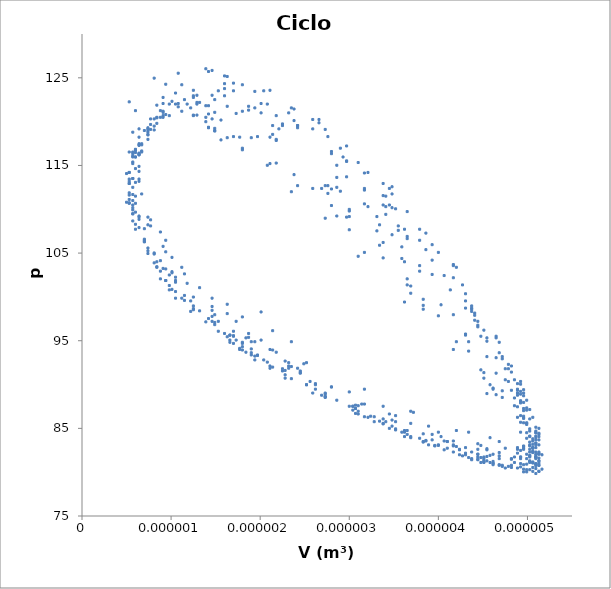
| Category | p (kPa) |
|---|---|
| 5.300000000000005e-07 | 122.258 |
| 4.580000000000001e-06 | 83.934 |
| 2.8000000000000003e-06 | 116.592 |
| 2.0100000000000002e-06 | 98.283 |
| 4.923000000000001e-06 | 89.221 |
| 6.000000000000007e-07 | 121.252 |
| 4.683000000000001e-06 | 83.496 |
| 2.42e-06 | 119.551 |
| 2.3500000000000004e-06 | 94.886 |
| 4.648000000000001e-06 | 93.059 |
| 6.000000000000007e-07 | 115.965 |
| 4.957000000000001e-06 | 82.928 |
| 1.63e-06 | 125.153 |
| 3.1700000000000006e-06 | 89.473 |
| 4.065000000000001e-06 | 102.437 |
| 9.4e-07 | 106.465 |
| 4.991400000000001e-06 | 84.502 |
| 8.100000000000004e-07 | 124.964 |
| 4.340000000000001e-06 | 84.566 |
| 2.9300000000000003e-06 | 115.965 |
| 2.1400000000000003e-06 | 96.145 |
| 4.717000000000001e-06 | 93.186 |
| 6.400000000000003e-07 | 114.328 |
| 5.025700000000001e-06 | 82.991 |
| 1.3900000000000002e-06 | 126.033 |
| 3.7200000000000004e-06 | 86.83 |
| 3.4500000000000004e-06 | 110.489 |
| 1.63e-06 | 99.163 |
| 4.8880000000000005e-06 | 90.101 |
| 5.300000000000005e-07 | 116.533 |
| 4.957000000000001e-06 | 82.991 |
| 1.4600000000000004e-06 | 125.844 |
| 3.6900000000000002e-06 | 86.956 |
| 3.3800000000000002e-06 | 111.558 |
| 1.8000000000000001e-06 | 97.715 |
| 4.8200000000000004e-06 | 92.117 |
| 6.400000000000003e-07 | 113.448 |
| 5.0943000000000005e-06 | 83.307 |
| 1.0800000000000002e-06 | 125.528 |
| 4.202000000000001e-06 | 84.755 |
| 2.7600000000000003e-06 | 118.293 |
| 2.5200000000000004e-06 | 92.495 |
| 4.305e-06 | 100.358 |
| 1.01e-06 | 104.512 |
| 5.025700000000001e-06 | 87.146 |
| 5.700000000000002e-07 | 118.798 |
| 4.8880000000000005e-06 | 82.802 |
| 1.4200000000000004e-06 | 125.718 |
| 3.890000000000001e-06 | 85.256 |
| 2.9e-06 | 116.971 |
| 2.4900000000000003e-06 | 92.369 |
| 4.271e-06 | 101.368 |
| 1.1500000000000004e-06 | 102.626 |
| 4.957000000000001e-06 | 89.41 |
| 6.000000000000007e-07 | 114.643 |
| 5.0943000000000005e-06 | 83.307 |
| 9.4e-07 | 124.27 |
| 4.4430000000000005e-06 | 83.244 |
| 2.11e-06 | 123.579 |
| 3.3800000000000002e-06 | 87.524 |
| 3.3800000000000002e-06 | 112.943 |
| 2.1400000000000003e-06 | 93.939 |
| 4.305e-06 | 99.541 |
| 1.01e-06 | 102.875 |
| 4.8880000000000005e-06 | 89.347 |
| 5.300000000000005e-07 | 112.943 |
| 5.1286e-06 | 84.061 |
| 8.400000000000001e-07 | 121.879 |
| 4.751000000000001e-06 | 82.739 |
| 1.6000000000000004e-06 | 125.216 |
| 4.000000000000001e-06 | 84.566 |
| 2.6600000000000004e-06 | 120.246 |
| 3e-06 | 89.158 |
| 3.65e-06 | 109.736 |
| 1.94e-06 | 94.886 |
| 4.374000000000001e-06 | 98.598 |
| 1.0500000000000005e-06 | 102.248 |
| 4.923000000000001e-06 | 90.041 |
| 6.000000000000007e-07 | 110.679 |
| 5.0943000000000005e-06 | 84.502 |
| 6.400000000000003e-07 | 119.172 |
| 4.8880000000000005e-06 | 82.613 |
| 1.1199999999999999e-06 | 124.207 |
| 4.4770000000000005e-06 | 83.055 |
| 2.0400000000000004e-06 | 123.516 |
| 3.6900000000000002e-06 | 85.572 |
| 2.9700000000000004e-06 | 117.224 |
| 2.8000000000000003e-06 | 89.726 |
| 3.7900000000000006e-06 | 107.724 |
| 1.8400000000000002e-06 | 95.324 |
| 4.408000000000001e-06 | 98.157 |
| 1.0500000000000005e-06 | 101.68 |
| 4.923000000000001e-06 | 90.353 |
| 6.400000000000003e-07 | 109.104 |
| 5.0943000000000005e-06 | 85.13 |
| 6.000000000000007e-07 | 116.782 |
| 4.957000000000001e-06 | 82.739 |
| 9.100000000000003e-07 | 122.763 |
| 4.5450000000000005e-06 | 82.55 |
| 1.7000000000000002e-06 | 124.396 |
| 4.03e-06 | 84.061 |
| 2.59e-06 | 120.246 |
| 3.1700000000000006e-06 | 87.773 |
| 3.48e-06 | 112.568 |
| 2.3200000000000002e-06 | 92.117 |
| 4.202000000000001e-06 | 103.38 |
| 1.4900000000000001e-06 | 97.967 |
| 4.683000000000001e-06 | 94.823 |
| 8.800000000000006e-07 | 104.134 |
| 4.991400000000001e-06 | 88.215 |
| 5.700000000000002e-07 | 111.685 |
| 5.0943000000000005e-06 | 84.124 |
| 6.400000000000003e-07 | 118.23 |
| 4.923000000000001e-06 | 82.486 |
| 1.0500000000000005e-06 | 123.264 |
| 4.5450000000000005e-06 | 82.676 |
| 1.8000000000000001e-06 | 124.207 |
| 3.9300000000000005e-06 | 84.313 |
| 2.6600000000000004e-06 | 119.867 |
| 3.1400000000000004e-06 | 87.773 |
| 3.4500000000000004e-06 | 112.379 |
| 2.3200000000000002e-06 | 91.864 |
| 4.168000000000001e-06 | 103.696 |
| 1.5300000000000002e-06 | 97.214 |
| 4.648000000000001e-06 | 95.513 |
| 9.100000000000003e-07 | 103.254 |
| 4.957000000000001e-06 | 89.031 |
| 5.700000000000002e-07 | 109.925 |
| 5.0943000000000005e-06 | 84.692 |
| 6.000000000000007e-07 | 116.845 |
| 4.957000000000001e-06 | 82.613 |
| 9.100000000000003e-07 | 122.068 |
| 4.683000000000001e-06 | 82.238 |
| 1.6000000000000004e-06 | 124.333 |
| 4.168000000000001e-06 | 83.56 |
| 2.3500000000000004e-06 | 121.567 |
| 3.4500000000000004e-06 | 86.641 |
| 3.1000000000000004e-06 | 115.334 |
| 2.6200000000000003e-06 | 90.101 |
| 3.86e-06 | 107.282 |
| 1.8000000000000001e-06 | 94.697 |
| 4.374000000000001e-06 | 98.725 |
| 1.1500000000000004e-06 | 100.169 |
| 4.8200000000000004e-06 | 91.422 |
| 7.000000000000006e-07 | 106.339 |
| 5.060000000000001e-06 | 86.262 |
| 5.300000000000005e-07 | 113.196 |
| 5.025700000000001e-06 | 83.118 |
| 8.100000000000004e-07 | 119.488 |
| 4.8880000000000005e-06 | 82.175 |
| 1.2500000000000003e-06 | 123.579 |
| 4.4430000000000005e-06 | 82.613 |
| 1.94e-06 | 123.453 |
| 3.830000000000001e-06 | 84.376 |
| 2.73e-06 | 119.113 |
| 3.0700000000000003e-06 | 87.647 |
| 3.48e-06 | 111.748 |
| 2.28e-06 | 91.612 |
| 4.168000000000001e-06 | 103.569 |
| 1.4900000000000001e-06 | 96.835 |
| 4.648000000000001e-06 | 95.324 |
| 8.800000000000006e-07 | 102.938 |
| 4.957000000000001e-06 | 88.72 |
| 5.700000000000002e-07 | 109.483 |
| 5.1286e-06 | 84.439 |
| 6.7e-07 | 116.533 |
| 5.025700000000001e-06 | 82.301 |
| 9.800000000000004e-07 | 122.005 |
| 4.614000000000001e-06 | 82.049 |
| 1.6000000000000004e-06 | 123.769 |
| 4.1000000000000006e-06 | 83.496 |
| 2.38e-06 | 121.441 |
| 3.3800000000000002e-06 | 86.077 |
| 3.21e-06 | 114.202 |
| 2.5200000000000004e-06 | 89.978 |
| 3.9300000000000005e-06 | 105.96 |
| 1.7000000000000002e-06 | 95.513 |
| 4.4430000000000005e-06 | 97.214 |
| 1.01e-06 | 100.863 |
| 4.8540000000000005e-06 | 90.542 |
| 6.000000000000007e-07 | 107.724 |
| 5.1286e-06 | 85.003 |
| 6.400000000000003e-07 | 114.896 |
| 5.060000000000001e-06 | 82.238 |
| 9.100000000000003e-07 | 121.188 |
| 4.683000000000001e-06 | 81.859 |
| 1.5300000000000002e-06 | 123.516 |
| 4.168000000000001e-06 | 82.991 |
| 2.3200000000000002e-06 | 120.999 |
| 3.41e-06 | 85.761 |
| 3.1700000000000006e-06 | 114.138 |
| 2.5200000000000004e-06 | 89.978 |
| 4.000000000000001e-06 | 105.08 |
| 1.63e-06 | 95.45 |
| 4.5110000000000005e-06 | 96.208 |
| 9.4e-07 | 101.869 |
| 4.923000000000001e-06 | 88.905 |
| 6.400000000000003e-07 | 108.856 |
| 5.1286e-06 | 84.313 |
| 6.400000000000003e-07 | 116.218 |
| 4.991400000000001e-06 | 82.049 |
| 1.01e-06 | 122.321 |
| 4.580000000000001e-06 | 81.922 |
| 1.7000000000000002e-06 | 123.516 |
| 3.9300000000000005e-06 | 83.686 |
| 2.59e-06 | 119.172 |
| 3.1000000000000004e-06 | 86.956 |
| 3.41e-06 | 111.499 |
| 2.25e-06 | 91.548 |
| 4.168000000000001e-06 | 102.185 |
| 1.4200000000000004e-06 | 97.529 |
| 4.683000000000001e-06 | 93.628 |
| 8.100000000000004e-07 | 103.885 |
| 4.991400000000001e-06 | 87.083 |
| 6.000000000000007e-07 | 111.499 |
| 5.1286e-06 | 83.118 |
| 7.400000000000002e-07 | 118.482 |
| 4.8540000000000005e-06 | 81.733 |
| 1.2500000000000003e-06 | 122.763 |
| 4.374000000000001e-06 | 82.301 |
| 2.0800000000000004e-06 | 122.005 |
| 3.6200000000000005e-06 | 84.755 |
| 2.9700000000000004e-06 | 115.523 |
| 2.73e-06 | 89.031 |
| 3.7900000000000006e-06 | 106.465 |
| 1.7700000000000004e-06 | 94.002 |
| 4.4430000000000005e-06 | 96.772 |
| 9.800000000000004e-07 | 100.8 |
| 4.8880000000000005e-06 | 88.783 |
| 5.700000000000002e-07 | 108.667 |
| 5.1286e-06 | 83.686 |
| 6.7e-07 | 116.655 |
| 4.923000000000001e-06 | 81.733 |
| 1.1500000000000004e-06 | 122.51 |
| 4.4430000000000005e-06 | 82.049 |
| 2.0100000000000002e-06 | 122.068 |
| 3.65e-06 | 84.755 |
| 2.9700000000000004e-06 | 115.46 |
| 2.69e-06 | 88.783 |
| 3.86e-06 | 105.392 |
| 1.6600000000000002e-06 | 94.823 |
| 4.5450000000000005e-06 | 95.324 |
| 8.800000000000006e-07 | 102.058 |
| 4.991400000000001e-06 | 87.335 |
| 5.300000000000005e-07 | 110.679 |
| 5.060000000000001e-06 | 82.802 |
| 8.100000000000004e-07 | 119.05 |
| 4.8200000000000004e-06 | 81.544 |
| 1.4600000000000004e-06 | 123.011 |
| 4.168000000000001e-06 | 83.118 |
| 2.42e-06 | 119.551 |
| 3.21e-06 | 86.262 |
| 3.48e-06 | 110.178 |
| 2.1400000000000003e-06 | 91.99 |
| 4.374000000000001e-06 | 98.973 |
| 1.1500000000000004e-06 | 99.604 |
| 4.8880000000000005e-06 | 89.473 |
| 6.000000000000007e-07 | 108.288 |
| 5.060000000000001e-06 | 83.56 |
| 6.400000000000003e-07 | 117.476 |
| 4.8200000000000004e-06 | 81.48 |
| 1.2900000000000004e-06 | 123.011 |
| 4.202000000000001e-06 | 82.928 |
| 2.38e-06 | 120.119 |
| 3.2400000000000003e-06 | 86.388 |
| 3.52e-06 | 110.051 |
| 2.0800000000000004e-06 | 92.558 |
| 4.408000000000001e-06 | 97.904 |
| 1.0500000000000005e-06 | 100.611 |
| 4.923000000000001e-06 | 88.152 |
| 5.700000000000002e-07 | 110.178 |
| 5.060000000000001e-06 | 82.739 |
| 7.700000000000008e-07 | 119.677 |
| 4.683000000000001e-06 | 81.544 |
| 1.6000000000000004e-06 | 122.948 |
| 3.86e-06 | 83.56 |
| 2.8000000000000003e-06 | 116.344 |
| 2.73e-06 | 88.657 |
| 3.9300000000000005e-06 | 104.197 |
| 1.6000000000000004e-06 | 95.829 |
| 4.7860000000000004e-06 | 92.306 |
| 7.400000000000002e-07 | 105.581 |
| 5.0943000000000005e-06 | 84.502 |
| 6.000000000000007e-07 | 115.965 |
| 4.923000000000001e-06 | 81.544 |
| 1.2500000000000003e-06 | 122.948 |
| 4.237e-06 | 82.613 |
| 2.42e-06 | 119.299 |
| 3.0700000000000003e-06 | 87.272 |
| 3.6200000000000005e-06 | 107.724 |
| 1.8000000000000001e-06 | 93.939 |
| 4.5450000000000005e-06 | 94.949 |
| 8.400000000000001e-07 | 103.38 |
| 4.991400000000001e-06 | 85.635 |
| 5e-07 | 114.075 |
| 4.923000000000001e-06 | 81.733 |
| 1.0800000000000002e-06 | 122.068 |
| 4.4430000000000005e-06 | 82.049 |
| 2.1800000000000003e-06 | 120.683 |
| 3.3800000000000002e-06 | 85.572 |
| 3.41e-06 | 110.3 |
| 2.11e-06 | 92.117 |
| 4.408000000000001e-06 | 97.34 |
| 9.800000000000004e-07 | 101.305 |
| 4.957000000000001e-06 | 87.019 |
| 5.300000000000005e-07 | 111.874 |
| 5.025700000000001e-06 | 81.922 |
| 8.800000000000006e-07 | 121.252 |
| 4.4770000000000005e-06 | 81.67 |
| 1.94e-06 | 121.567 |
| 3.48e-06 | 85.256 |
| 3.1700000000000006e-06 | 112.19 |
| 2.28e-06 | 91.111 |
| 4.374000000000001e-06 | 98.346 |
| 1.1199999999999999e-06 | 99.857 |
| 4.957000000000001e-06 | 87.962 |
| 5.700000000000002e-07 | 110.489 |
| 5.060000000000001e-06 | 82.301 |
| 8.400000000000001e-07 | 120.494 |
| 4.5450000000000005e-06 | 81.796 |
| 1.8700000000000003e-06 | 121.753 |
| 3.5900000000000004e-06 | 84.566 |
| 3.1700000000000006e-06 | 112.379 |
| 2.28e-06 | 90.732 |
| 4.305e-06 | 98.725 |
| 1.0500000000000005e-06 | 99.857 |
| 4.8880000000000005e-06 | 87.461 |
| 5e-07 | 110.805 |
| 5.025700000000001e-06 | 81.859 |
| 9.4e-07 | 120.81 |
| 4.5110000000000005e-06 | 81.417 |
| 2.0100000000000002e-06 | 120.999 |
| 3.4500000000000004e-06 | 85.003 |
| 3.3800000000000002e-06 | 110.489 |
| 2.11e-06 | 91.864 |
| 4.4430000000000005e-06 | 96.583 |
| 9.4e-07 | 101.869 |
| 5.025700000000001e-06 | 86.077 |
| 5.300000000000005e-07 | 112.943 |
| 4.991400000000001e-06 | 81.544 |
| 1.0500000000000005e-06 | 122.005 |
| 4.305e-06 | 81.985 |
| 2.25e-06 | 119.551 |
| 3.1000000000000004e-06 | 86.641 |
| 3.65e-06 | 106.903 |
| 1.8000000000000001e-06 | 94.318 |
| 4.717000000000001e-06 | 92.933 |
| 8.100000000000004e-07 | 104.891 |
| 5.0943000000000005e-06 | 83.934 |
| 6.400000000000003e-07 | 116.407 |
| 4.8540000000000005e-06 | 81.106 |
| 1.4900000000000001e-06 | 122.51 |
| 3.96e-06 | 82.991 |
| 2.86e-06 | 115.022 |
| 2.59e-06 | 89.031 |
| 4.1340000000000006e-06 | 100.8 |
| 1.2200000000000006e-06 | 98.346 |
| 4.923000000000001e-06 | 88.089 |
| 5.300000000000005e-07 | 110.742 |
| 5.025700000000001e-06 | 81.733 |
| 9.100000000000003e-07 | 121.062 |
| 4.374000000000001e-06 | 81.544 |
| 2.25e-06 | 119.741 |
| 3.1700000000000006e-06 | 86.325 |
| 3.65e-06 | 106.651 |
| 1.7000000000000002e-06 | 94.697 |
| 4.751000000000001e-06 | 91.801 |
| 7.000000000000006e-07 | 106.465 |
| 5.060000000000001e-06 | 82.802 |
| 7.400000000000002e-07 | 118.545 |
| 4.580000000000001e-06 | 81.106 |
| 1.8000000000000001e-06 | 121.188 |
| 3.52e-06 | 84.818 |
| 3.41e-06 | 109.42 |
| 1.94e-06 | 92.807 |
| 4.5450000000000005e-06 | 93.186 |
| 7.400000000000002e-07 | 104.954 |
| 5.060000000000001e-06 | 83.181 |
| 7.400000000000002e-07 | 117.977 |
| 4.683000000000001e-06 | 80.853 |
| 1.8700000000000003e-06 | 121.315 |
| 3.52e-06 | 84.944 |
| 3.5500000000000003e-06 | 108.098 |
| 1.8400000000000002e-06 | 93.691 |
| 4.7860000000000004e-06 | 91.801 |
| 7.000000000000006e-07 | 106.587 |
| 5.1286e-06 | 82.301 |
| 8.400000000000001e-07 | 119.804 |
| 4.4770000000000005e-06 | 81.106 |
| 2.2100000000000004e-06 | 119.172 |
| 3.0700000000000003e-06 | 86.704 |
| 3.7900000000000006e-06 | 103.569 |
| 1.3900000000000002e-06 | 97.151 |
| 4.923000000000001e-06 | 87.899 |
| 5.300000000000005e-07 | 111.621 |
| 5.060000000000001e-06 | 81.106 |
| 1.2900000000000004e-06 | 122.194 |
| 4.1000000000000006e-06 | 82.739 |
| 2.9700000000000004e-06 | 113.701 |
| 2.3500000000000004e-06 | 90.669 |
| 4.4770000000000005e-06 | 95.513 |
| 8.400000000000001e-07 | 104.007 |
| 5.0943000000000005e-06 | 83.118 |
| 7.400000000000002e-07 | 118.798 |
| 4.5450000000000005e-06 | 81.291 |
| 2.1400000000000003e-06 | 119.551 |
| 3.04e-06 | 87.524 |
| 3.9300000000000005e-06 | 102.563 |
| 1.2500000000000003e-06 | 98.662 |
| 4.957000000000001e-06 | 86.203 |
| 5.300000000000005e-07 | 114.202 |
| 4.923000000000001e-06 | 80.979 |
| 1.63e-06 | 121.753 |
| 3.6200000000000005e-06 | 84.566 |
| 3.5500000000000003e-06 | 107.597 |
| 1.7000000000000002e-06 | 95.576 |
| 4.8880000000000005e-06 | 89.031 |
| 5.700000000000002e-07 | 110.994 |
| 5.025700000000001e-06 | 81.106 |
| 1.32e-06 | 122.194 |
| 3.86e-06 | 83.623 |
| 3.21e-06 | 110.3 |
| 1.9000000000000004e-06 | 93.375 |
| 4.751000000000001e-06 | 90.542 |
| 5.700000000000002e-07 | 109.483 |
| 5.025700000000001e-06 | 81.291 |
| 1.1800000000000001e-06 | 122.005 |
| 3.890000000000001e-06 | 83.118 |
| 3.1700000000000006e-06 | 110.615 |
| 1.97e-06 | 93.312 |
| 4.7860000000000004e-06 | 90.353 |
| 6.000000000000007e-07 | 109.673 |
| 5.060000000000001e-06 | 81.043 |
| 1.2900000000000004e-06 | 122.005 |
| 3.830000000000001e-06 | 83.433 |
| 3.31e-06 | 109.168 |
| 1.7700000000000004e-06 | 94.129 |
| 4.8200000000000004e-06 | 89.347 |
| 5.300000000000005e-07 | 111.12 |
| 4.957000000000001e-06 | 80.853 |
| 1.4200000000000004e-06 | 121.816 |
| 3.6200000000000005e-06 | 84.061 |
| 3.48e-06 | 107.092 |
| 1.5300000000000002e-06 | 96.081 |
| 4.957000000000001e-06 | 87.272 |
| 5.700000000000002e-07 | 113.511 |
| 4.923000000000001e-06 | 80.601 |
| 1.7300000000000004e-06 | 120.936 |
| 3.3800000000000002e-06 | 85.508 |
| 3.7900000000000006e-06 | 102.938 |
| 1.2500000000000003e-06 | 98.973 |
| 5.025700000000001e-06 | 84.944 |
| 6.000000000000007e-07 | 116.719 |
| 4.614000000000001e-06 | 81.043 |
| 2.1400000000000003e-06 | 118.545 |
| 2.86e-06 | 88.215 |
| 4.168000000000001e-06 | 97.967 |
| 8.400000000000001e-07 | 103.443 |
| 5.025700000000001e-06 | 82.613 |
| 8.100000000000004e-07 | 120.309 |
| 4.237e-06 | 81.985 |
| 2.86e-06 | 113.637 |
| 2.25e-06 | 91.801 |
| 4.648000000000001e-06 | 91.3 |
| 6.400000000000003e-07 | 109.231 |
| 5.060000000000001e-06 | 81.169 |
| 1.3900000000000002e-06 | 121.816 |
| 3.65e-06 | 84.313 |
| 3.5900000000000004e-06 | 105.708 |
| 1.4600000000000004e-06 | 97.214 |
| 4.991400000000001e-06 | 85.572 |
| 5.700000000000002e-07 | 116.091 |
| 4.614000000000001e-06 | 80.853 |
| 2.1800000000000003e-06 | 117.977 |
| 2.73e-06 | 88.594 |
| 4.305e-06 | 95.766 |
| 7.400000000000002e-07 | 105.266 |
| 5.0943000000000005e-06 | 82.049 |
| 1.0800000000000002e-06 | 121.69 |
| 3.96e-06 | 83.055 |
| 3.34e-06 | 108.225 |
| 1.6600000000000002e-06 | 95.64 |
| 4.957000000000001e-06 | 86.388 |
| 5.700000000000002e-07 | 115.212 |
| 4.717000000000001e-06 | 80.79 |
| 2.1800000000000003e-06 | 117.851 |
| 2.73e-06 | 88.905 |
| 4.340000000000001e-06 | 94.886 |
| 7.000000000000006e-07 | 106.276 |
| 5.025700000000001e-06 | 81.228 |
| 1.2200000000000006e-06 | 121.567 |
| 3.6900000000000002e-06 | 84.061 |
| 3.5900000000000004e-06 | 104.386 |
| 1.2500000000000003e-06 | 98.535 |
| 5.0943000000000005e-06 | 83.686 |
| 7.400000000000002e-07 | 118.987 |
| 4.340000000000001e-06 | 81.67 |
| 2.86e-06 | 112.505 |
| 2.0400000000000004e-06 | 92.807 |
| 4.8540000000000005e-06 | 88.467 |
| 5.300000000000005e-07 | 113.448 |
| 4.8200000000000004e-06 | 80.79 |
| 2.11e-06 | 118.23 |
| 2.73e-06 | 88.53 |
| 4.340000000000001e-06 | 93.817 |
| 6.400000000000003e-07 | 107.909 |
| 4.991400000000001e-06 | 80.916 |
| 1.4900000000000001e-06 | 121.062 |
| 3.2800000000000004e-06 | 85.761 |
| 4.03e-06 | 99.1 |
| 9.4e-07 | 103.191 |
| 5.1286e-06 | 81.607 |
| 1.1199999999999999e-06 | 121.188 |
| 3.7900000000000006e-06 | 83.871 |
| 3.6200000000000005e-06 | 104.007 |
| 1.2200000000000006e-06 | 99.541 |
| 5.0943000000000005e-06 | 82.802 |
| 8.800000000000006e-07 | 120.494 |
| 4.065000000000001e-06 | 82.55 |
| 3.31e-06 | 107.534 |
| 1.4900000000000001e-06 | 97.087 |
| 5.025700000000001e-06 | 84.124 |
| 7.000000000000006e-07 | 118.987 |
| 4.271e-06 | 81.859 |
| 3e-06 | 109.988 |
| 1.6600000000000002e-06 | 95.075 |
| 4.923000000000001e-06 | 85.698 |
| 6.7e-07 | 117.35 |
| 4.4430000000000005e-06 | 81.417 |
| 2.9e-06 | 112.063 |
| 1.9000000000000004e-06 | 93.628 |
| 4.957000000000001e-06 | 86.14 |
| 6.000000000000007e-07 | 116.47 |
| 4.5110000000000005e-06 | 81.169 |
| 2.7600000000000003e-06 | 112.695 |
| 1.97e-06 | 93.375 |
| 4.923000000000001e-06 | 86.451 |
| 5.700000000000002e-07 | 115.965 |
| 4.5110000000000005e-06 | 81.106 |
| 2.73e-06 | 112.695 |
| 1.94e-06 | 93.249 |
| 4.8880000000000005e-06 | 86.262 |
| 5.700000000000002e-07 | 116.533 |
| 4.5110000000000005e-06 | 81.228 |
| 2.8000000000000003e-06 | 112.316 |
| 1.9000000000000004e-06 | 94.065 |
| 4.991400000000001e-06 | 85.445 |
| 6.7e-07 | 117.476 |
| 4.374000000000001e-06 | 81.417 |
| 3e-06 | 109.799 |
| 1.6600000000000002e-06 | 95.64 |
| 5.025700000000001e-06 | 84.061 |
| 7.400000000000002e-07 | 119.172 |
| 4.168000000000001e-06 | 82.301 |
| 3.3800000000000002e-06 | 106.213 |
| 1.32e-06 | 98.409 |
| 5.060000000000001e-06 | 82.427 |
| 9.100000000000003e-07 | 120.683 |
| 3.6900000000000002e-06 | 83.934 |
| 3.6900000000000002e-06 | 101.242 |
| 9.800000000000004e-07 | 102.5 |
| 5.1286e-06 | 81.043 |
| 1.4200000000000004e-06 | 120.873 |
| 3.34e-06 | 85.824 |
| 4.305e-06 | 95.64 |
| 7.000000000000006e-07 | 107.783 |
| 4.991400000000001e-06 | 80.285 |
| 1.97e-06 | 118.293 |
| 2.6200000000000003e-06 | 89.473 |
| 4.717000000000001e-06 | 89.284 |
| 5.300000000000005e-07 | 114.202 |
| 4.614000000000001e-06 | 81.228 |
| 2.7600000000000003e-06 | 111.811 |
| 1.7300000000000004e-06 | 95.075 |
| 4.991400000000001e-06 | 83.871 |
| 7.700000000000008e-07 | 120.309 |
| 4.000000000000001e-06 | 83.055 |
| 3.65e-06 | 102.058 |
| 1.01e-06 | 102.749 |
| 5.0943000000000005e-06 | 80.727 |
| 1.5600000000000003e-06 | 120.182 |
| 3e-06 | 87.524 |
| 4.5110000000000005e-06 | 91.359 |
| 5.700000000000002e-07 | 112.505 |
| 4.717000000000001e-06 | 80.664 |
| 2.69e-06 | 112.379 |
| 1.8000000000000001e-06 | 94.823 |
| 5.025700000000001e-06 | 83.433 |
| 8.400000000000001e-07 | 120.431 |
| 3.830000000000001e-06 | 83.496 |
| 3.830000000000001e-06 | 99.731 |
| 8.100000000000004e-07 | 105.017 |
| 5.025700000000001e-06 | 80.285 |
| 1.9000000000000004e-06 | 118.166 |
| 2.6200000000000003e-06 | 89.978 |
| 4.8540000000000005e-06 | 87.584 |
| 6.400000000000003e-07 | 116.218 |
| 4.4430000000000005e-06 | 81.733 |
| 3.34e-06 | 105.897 |
| 1.2500000000000003e-06 | 99.983 |
| 5.0943000000000005e-06 | 80.916 |
| 1.4600000000000004e-06 | 120.309 |
| 3.04e-06 | 87.083 |
| 4.5110000000000005e-06 | 90.732 |
| 5.700000000000002e-07 | 113.511 |
| 4.614000000000001e-06 | 80.979 |
| 2.9700000000000004e-06 | 109.104 |
| 1.4600000000000004e-06 | 97.778 |
| 5.0943000000000005e-06 | 81.67 |
| 1.2900000000000004e-06 | 120.747 |
| 3.2800000000000004e-06 | 86.325 |
| 4.4770000000000005e-06 | 91.675 |
| 6.000000000000007e-07 | 113.069 |
| 4.683000000000001e-06 | 80.79 |
| 3e-06 | 109.168 |
| 1.4600000000000004e-06 | 98.472 |
| 5.1286e-06 | 81.291 |
| 1.3900000000000002e-06 | 120.494 |
| 3.04e-06 | 87.524 |
| 4.614000000000001e-06 | 89.6 |
| 5.700000000000002e-07 | 115.397 |
| 4.4430000000000005e-06 | 81.48 |
| 3.3800000000000002e-06 | 104.449 |
| 1.0500000000000005e-06 | 101.869 |
| 5.060000000000001e-06 | 80.538 |
| 1.7700000000000004e-06 | 118.23 |
| 2.56e-06 | 90.353 |
| 4.957000000000001e-06 | 85.635 |
| 7.700000000000008e-07 | 119.113 |
| 4.000000000000001e-06 | 83.118 |
| 4.000000000000001e-06 | 97.841 |
| 7.700000000000008e-07 | 108.098 |
| 4.957000000000001e-06 | 80.348 |
| 2.59e-06 | 112.379 |
| 1.7000000000000002e-06 | 96.081 |
| 5.0943000000000005e-06 | 82.301 |
| 1.2500000000000003e-06 | 120.683 |
| 3.0700000000000003e-06 | 87.272 |
| 4.648000000000001e-06 | 88.842 |
| 5.700000000000002e-07 | 116.344 |
| 4.305e-06 | 82.175 |
| 3.65e-06 | 101.368 |
| 9.100000000000003e-07 | 105.771 |
| 5.060000000000001e-06 | 80.096 |
| 2.38e-06 | 113.953 |
| 1.8700000000000003e-06 | 95.387 |
| 5.1286e-06 | 82.112 |
| 1.2500000000000003e-06 | 120.747 |
| 3.1000000000000004e-06 | 87.584 |
| 4.717000000000001e-06 | 88.53 |
| 6.400000000000003e-07 | 117.287 |
| 4.237e-06 | 82.55 |
| 3.830000000000001e-06 | 99.036 |
| 7.400000000000002e-07 | 108.225 |
| 4.8880000000000005e-06 | 80.474 |
| 2.8000000000000003e-06 | 110.426 |
| 1.4600000000000004e-06 | 98.91 |
| 5.0943000000000005e-06 | 80.916 |
| 1.7000000000000002e-06 | 118.293 |
| 2.4500000000000003e-06 | 91.3 |
| 5.060000000000001e-06 | 83.808 |
| 9.800000000000004e-07 | 120.683 |
| 3.48e-06 | 85.95 |
| 4.580000000000001e-06 | 89.978 |
| 6.400000000000003e-07 | 116.281 |
| 4.305e-06 | 82.802 |
| 3.830000000000001e-06 | 98.598 |
| 7.400000000000002e-07 | 109.104 |
| 4.8200000000000004e-06 | 80.538 |
| 3e-06 | 107.661 |
| 1.1800000000000001e-06 | 101.553 |
| 5.0943000000000005e-06 | 80.411 |
| 2.1800000000000003e-06 | 115.275 |
| 1.9000000000000004e-06 | 94.886 |
| 5.0943000000000005e-06 | 81.733 |
| 1.3900000000000002e-06 | 119.993 |
| 2.8000000000000003e-06 | 89.726 |
| 5.025700000000001e-06 | 84.692 |
| 9.100000000000003e-07 | 120.494 |
| 3.52e-06 | 85.761 |
| 4.614000000000001e-06 | 89.473 |
| 6.400000000000003e-07 | 117.35 |
| 4.1000000000000006e-06 | 83.496 |
| 4.202000000000001e-06 | 94.886 |
| 6.400000000000003e-07 | 113.196 |
| 4.5110000000000005e-06 | 81.607 |
| 3.6900000000000002e-06 | 100.421 |
| 7.700000000000008e-07 | 108.793 |
| 4.7860000000000004e-06 | 80.664 |
| 3.1700000000000006e-06 | 105.08 |
| 9.4e-07 | 105.144 |
| 4.957000000000001e-06 | 80.033 |
| 2.86e-06 | 109.231 |
| 1.32e-06 | 101.052 |
| 5.1286e-06 | 80.096 |
| 2.42e-06 | 112.695 |
| 1.63e-06 | 98.094 |
| 5.163e-06 | 80.348 |
| 2.11e-06 | 115.212 |
| 1.8700000000000003e-06 | 95.829 |
| 5.1286e-06 | 80.79 |
| 1.8000000000000001e-06 | 116.971 |
| 2.11e-06 | 94.002 |
| 5.1286e-06 | 81.291 |
| 1.63e-06 | 118.166 |
| 2.28e-06 | 92.681 |
| 5.0943000000000005e-06 | 81.922 |
| 1.4900000000000001e-06 | 118.987 |
| 2.3500000000000004e-06 | 92.053 |
| 5.163e-06 | 81.985 |
| 1.4900000000000001e-06 | 119.236 |
| 2.4500000000000003e-06 | 91.548 |
| 5.1286e-06 | 82.112 |
| 1.4200000000000004e-06 | 119.362 |
| 2.4500000000000003e-06 | 91.359 |
| 5.1286e-06 | 82.049 |
| 1.4200000000000004e-06 | 119.299 |
| 2.42e-06 | 91.864 |
| 5.0943000000000005e-06 | 81.733 |
| 1.4900000000000001e-06 | 118.924 |
| 2.3200000000000002e-06 | 92.495 |
| 5.0943000000000005e-06 | 81.544 |
| 1.5600000000000003e-06 | 117.914 |
| 2.1800000000000003e-06 | 93.691 |
| 5.0943000000000005e-06 | 80.979 |
| 1.8000000000000001e-06 | 116.782 |
| 2.0100000000000002e-06 | 95.075 |
| 5.1286e-06 | 80.79 |
| 2.0800000000000004e-06 | 115.022 |
| 1.7300000000000004e-06 | 97.214 |
| 5.1286e-06 | 80.096 |
| 2.3500000000000004e-06 | 112 |
| 1.4600000000000004e-06 | 99.857 |
| 5.0943000000000005e-06 | 79.847 |
| 2.73e-06 | 108.982 |
| 1.1199999999999999e-06 | 103.38 |
| 4.991400000000001e-06 | 80.033 |
| 3.1000000000000004e-06 | 104.639 |
| 8.800000000000006e-07 | 107.408 |
| 4.751000000000001e-06 | 80.474 |
| 3.6200000000000005e-06 | 99.415 |
| 6.7e-07 | 111.748 |
| 4.5110000000000005e-06 | 81.733 |
| 4.168000000000001e-06 | 94.002 |
| 6.400000000000003e-07 | 116.344 |
| 4.065000000000001e-06 | 83.56 |
| 4.5450000000000005e-06 | 88.968 |
| 7.400000000000002e-07 | 119.299 |
| 3.52e-06 | 86.451 |
| 4.923000000000001e-06 | 84.566 |